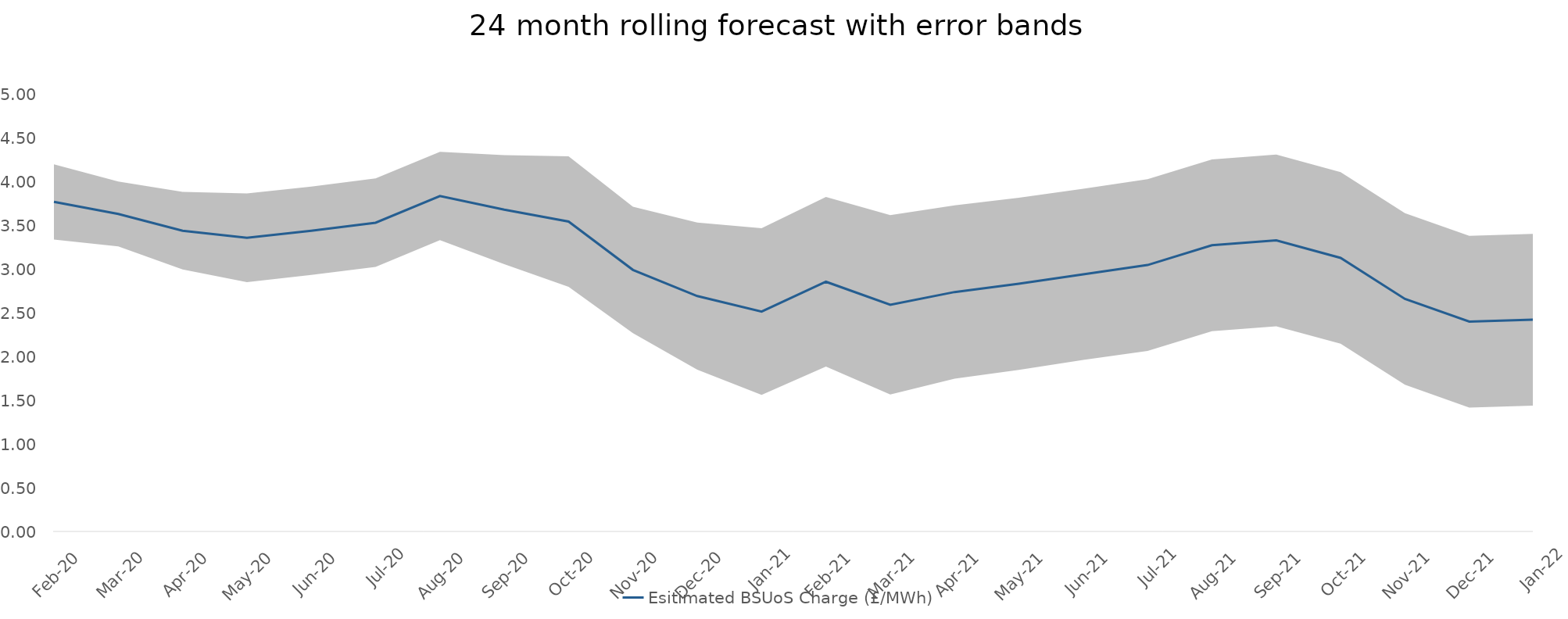
| Category | Esitimated BSUoS Charge (£/MWh) |
|---|---|
| Feb-20 | 3.772 |
| Mar-20 | 3.634 |
| Apr-20 | 3.442 |
| May-20 | 3.362 |
| Jun-20 | 3.441 |
| Jul-20 | 3.534 |
| Aug-20 | 3.839 |
| Sep-20 | 3.683 |
| Oct-20 | 3.547 |
| Nov-20 | 2.994 |
| Dec-20 | 2.694 |
| Jan-21 | 2.517 |
| Feb-21 | 2.858 |
| Mar-21 | 2.594 |
| Apr-21 | 2.74 |
| May-21 | 2.835 |
| Jun-21 | 2.943 |
| Jul-21 | 3.05 |
| Aug-21 | 3.275 |
| Sep-21 | 3.331 |
| Oct-21 | 3.131 |
| Nov-21 | 2.661 |
| Dec-21 | 2.401 |
| Jan-22 | 2.424 |